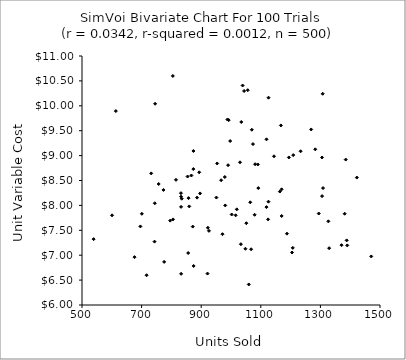
| Category | Series 0 |
|---|---|
| 854.2304992150957 | 8.58 |
| 1169.8612101544886 | 8.323 |
| 1371.0105038075726 | 7.201 |
| 1079.3100416607313 | 7.811 |
| 1282.8143712501453 | 9.126 |
| 1059.6817778812351 | 6.412 |
| 1124.5207805124694 | 7.719 |
| 1422.243596117321 | 8.559 |
| 805.4286285431208 | 7.719 |
| 834.7279760569274 | 8.134 |
| 1163.9249930490264 | 8.278 |
| 953.4724346896035 | 8.843 |
| 1002.3863059291955 | 7.818 |
| 832.46673787131 | 8.176 |
| 971.4091549471574 | 7.422 |
| 676.3192585275103 | 6.961 |
| 700.8362677956435 | 7.831 |
| 992.2861438405348 | 9.713 |
| 1208.8526924818707 | 9.01 |
| 757.3443138062273 | 8.429 |
| 1015.6611762761873 | 7.801 |
| 1125.6151042472584 | 8.075 |
| 1069.8917819320027 | 9.519 |
| 832.4779355059433 | 7.97 |
| 743.4577781368981 | 7.273 |
| 926.0074625134736 | 7.489 |
| 832.6524019448946 | 6.625 |
| 1048.4379801212203 | 7.129 |
| 1030.2035865437097 | 8.866 |
| 1269.0459592912462 | 9.525 |
| 1207.3383528489242 | 7.147 |
| 1167.419868229228 | 9.606 |
| 1307.7569829173165 | 10.241 |
| 1125.902538398584 | 10.162 |
| 1144.346987670863 | 8.986 |
| 1038.9570459175025 | 10.408 |
| 600.8797298106829 | 7.801 |
| 874.603444996067 | 6.784 |
| 804.8306583039259 | 10.6 |
| 732.2427400086109 | 8.643 |
| 990.2341857814116 | 8.808 |
| 867.0982547768922 | 8.6 |
| 1470.633751757023 | 6.975 |
| 1233.5875804751317 | 9.087 |
| 696.0218862822708 | 7.578 |
| 922.4155705003785 | 7.551 |
| 1294.5048946550708 | 7.837 |
| 1119.1458730094935 | 9.327 |
| 871.6810285204074 | 7.575 |
| 538.9908018000363 | 7.322 |
| 1090.0064026605994 | 8.822 |
| 1381.4380059949115 | 7.833 |
| 1034.4274075580267 | 9.675 |
| 886.1509308388434 | 8.156 |
| 951.0627538148608 | 8.157 |
| 997.1800475709239 | 9.292 |
| 613.5506962878214 | 9.894 |
| 893.3244129630722 | 8.664 |
| 979.2113113560837 | 8.57 |
| 1187.6953989895499 | 7.432 |
| 745.3334934036423 | 10.041 |
| 1033.2367039437734 | 7.221 |
| 966.9189485038161 | 8.505 |
| 1204.8465738497155 | 7.054 |
| 1308.8626778755079 | 8.348 |
| 1388.136836670917 | 7.298 |
| 831.9991147940208 | 8.246 |
| 773.3525200595174 | 8.31 |
| 1119.056043201873 | 7.966 |
| 896.2870831988334 | 8.24 |
| 980.6104859028452 | 7.999 |
| 775.6312556755869 | 6.866 |
| 744.2718811806145 | 8.043 |
| 1329.3307403705946 | 7.141 |
| 988.2144326386576 | 9.725 |
| 1043.8988304091743 | 10.297 |
| 815.30414517674 | 8.514 |
| 1073.694357936928 | 9.232 |
| 859.8738140657605 | 7.98 |
| 1051.3923178232073 | 7.642 |
| 1305.4874969343787 | 8.962 |
| 856.3551125800636 | 7.044 |
| 716.7415929467866 | 6.598 |
| 1019.4637411597444 | 7.921 |
| 1326.6852542907861 | 7.68 |
| 1390.1126832711989 | 7.197 |
| 921.2321974917412 | 6.631 |
| 1091.6443304564064 | 8.348 |
| 1080.9036500692785 | 8.827 |
| 795.8772844647125 | 7.694 |
| 1385.0025651443389 | 8.92 |
| 1305.7105710319795 | 8.187 |
| 857.5931844233969 | 8.146 |
| 873.9411724435046 | 9.093 |
| 1194.1909050114357 | 8.963 |
| 1067.4961717098668 | 7.119 |
| 1170.0797885633278 | 7.788 |
| 873.6827009415773 | 8.729 |
| 1056.208619638397 | 10.314 |
| 1064.546339232998 | 8.063 |